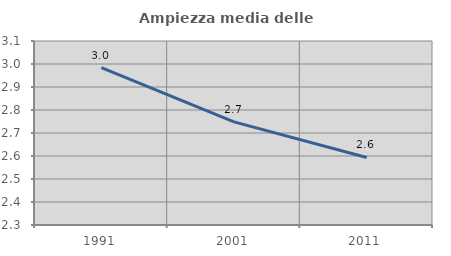
| Category | Ampiezza media delle famiglie |
|---|---|
| 1991.0 | 2.985 |
| 2001.0 | 2.748 |
| 2011.0 | 2.594 |